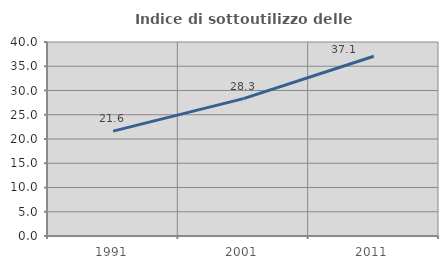
| Category | Indice di sottoutilizzo delle abitazioni  |
|---|---|
| 1991.0 | 21.615 |
| 2001.0 | 28.33 |
| 2011.0 | 37.054 |